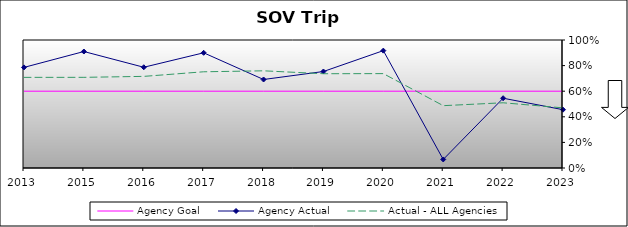
| Category | Agency Goal | Agency Actual | Actual - ALL Agencies |
|---|---|---|---|
| 2013.0 | 0.6 | 0.786 | 0.708 |
| 2015.0 | 0.6 | 0.91 | 0.708 |
| 2016.0 | 0.6 | 0.787 | 0.716 |
| 2017.0 | 0.6 | 0.9 | 0.752 |
| 2018.0 | 0.6 | 0.692 | 0.759 |
| 2019.0 | 0.6 | 0.754 | 0.736 |
| 2020.0 | 0.6 | 0.917 | 0.737 |
| 2021.0 | 0.6 | 0.067 | 0.487 |
| 2022.0 | 0.6 | 0.545 | 0.509 |
| 2023.0 | 0.6 | 0.456 | 0.47 |